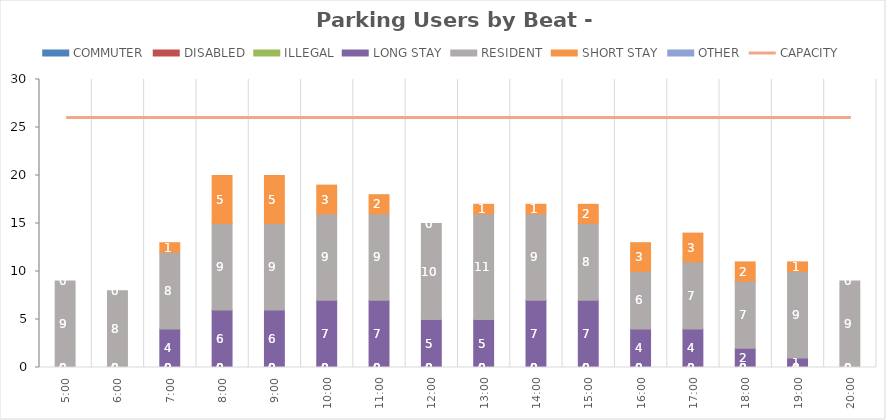
| Category | COMMUTER | DISABLED | ILLEGAL | LONG STAY | RESIDENT | SHORT STAY | OTHER |
|---|---|---|---|---|---|---|---|
| 0.20833333333333334 | 0 | 0 | 0 | 0 | 9 | 0 | 0 |
| 0.25 | 0 | 0 | 0 | 0 | 8 | 0 | 0 |
| 0.2916666666666667 | 0 | 0 | 0 | 4 | 8 | 1 | 0 |
| 0.3333333333333333 | 0 | 0 | 0 | 6 | 9 | 5 | 0 |
| 0.375 | 0 | 0 | 0 | 6 | 9 | 5 | 0 |
| 0.4166666666666667 | 0 | 0 | 0 | 7 | 9 | 3 | 0 |
| 0.4583333333333333 | 0 | 0 | 0 | 7 | 9 | 2 | 0 |
| 0.5 | 0 | 0 | 0 | 5 | 10 | 0 | 0 |
| 0.5416666666666666 | 0 | 0 | 0 | 5 | 11 | 1 | 0 |
| 0.5833333333333334 | 0 | 0 | 0 | 7 | 9 | 1 | 0 |
| 0.625 | 0 | 0 | 0 | 7 | 8 | 2 | 0 |
| 0.6666666666666666 | 0 | 0 | 0 | 4 | 6 | 3 | 0 |
| 0.7083333333333334 | 0 | 0 | 0 | 4 | 7 | 3 | 0 |
| 0.75 | 0 | 0 | 0 | 2 | 7 | 2 | 0 |
| 0.7916666666666666 | 0 | 0 | 0 | 1 | 9 | 1 | 0 |
| 0.8333333333333334 | 0 | 0 | 0 | 0 | 9 | 0 | 0 |